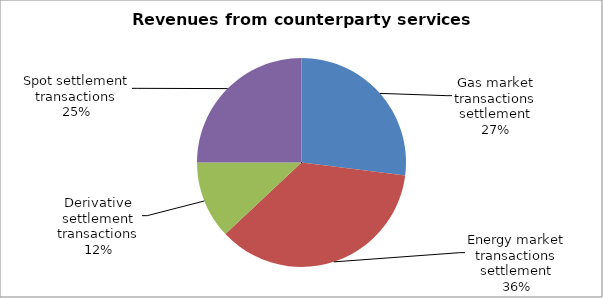
| Category | Series 0 |
|---|---|
| Gas market transactions settlement | 0.27 |
| Energy market transactions settlement | 0.36 |
| Derivative settlement transactions | 0.12 |
| Spot settlement transactions | 0.25 |